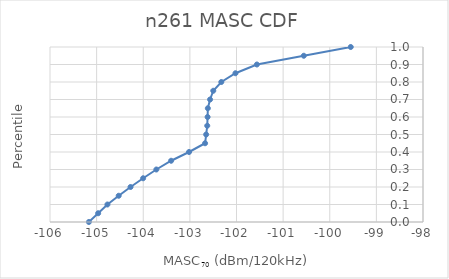
| Category | n261 |
|---|---|
| -105.16616962510335 | 0 |
| -104.96719329380684 | 0.05 |
| -104.76821696251034 | 0.1 |
| -104.5266 | 0.15 |
| -104.2728 | 0.2 |
| -104.0025 | 0.25 |
| -103.719 | 0.3 |
| -103.40196 | 0.35 |
| -103.01784 | 0.4 |
| -102.67382500000001 | 0.45 |
| -102.65065 | 0.5 |
| -102.62747499999999 | 0.55 |
| -102.62014365105853 | 0.6 |
| -102.61479275849939 | 0.65 |
| -102.56710638935243 | 0.7 |
| -102.49825228191158 | 0.75 |
| -102.32531110898779 | 0.8 |
| -102.02226110421036 | 0.85 |
| -101.5628999904451 | 0.9 |
| -100.55644999522255 | 0.95 |
| -99.55 | 1 |